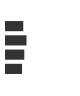
| Category | Series 0 |
|---|---|
| 0 | 0.243 |
| 1 | 0.289 |
| 2 | 0.258 |
| 3 | 0.226 |